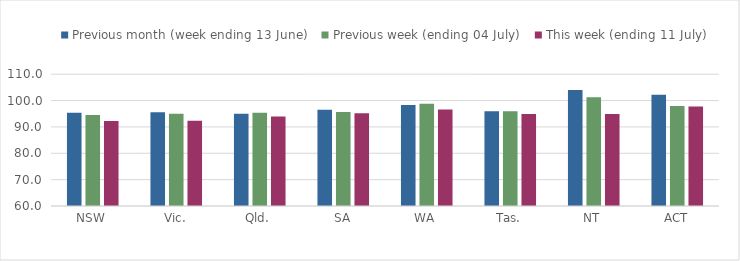
| Category | Previous month (week ending 13 June) | Previous week (ending 04 July) | This week (ending 11 July) |
|---|---|---|---|
| NSW | 95.324 | 94.513 | 92.276 |
| Vic. | 95.555 | 94.967 | 92.371 |
| Qld. | 95.018 | 95.376 | 93.931 |
| SA | 96.461 | 95.671 | 95.211 |
| WA | 98.304 | 98.809 | 96.575 |
| Tas. | 95.93 | 95.986 | 94.937 |
| NT | 103.98 | 101.27 | 94.875 |
| ACT | 102.178 | 97.897 | 97.787 |